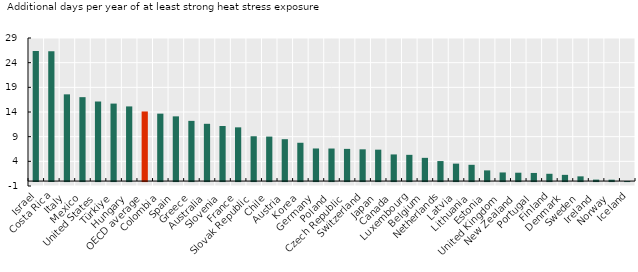
| Category | Series 0 |
|---|---|
| Israel | 26.378 |
| Costa Rica | 26.33 |
| Italy | 17.579 |
| Mexico | 17.01 |
| United States | 16.127 |
| Türkiye | 15.706 |
| Hungary | 15.131 |
| OECD average | 14.108 |
| Colombia | 13.666 |
| Spain | 13.116 |
| Greece | 12.203 |
| Australia | 11.608 |
| Slovenia | 11.167 |
| France | 10.89 |
| Slovak Republic | 9.085 |
| Chile | 9.019 |
| Austria | 8.488 |
| Korea | 7.765 |
| Germany | 6.606 |
| Poland | 6.595 |
| Czech Republic | 6.524 |
| Switzerland | 6.437 |
| Japan | 6.364 |
| Canada | 5.399 |
| Luxembourg | 5.317 |
| Belgium | 4.706 |
| Netherlands | 4.057 |
| Latvia | 3.533 |
| Lithuania | 3.295 |
| Estonia | 2.164 |
| United Kingdom | 1.747 |
| New Zealand | 1.694 |
| Portugal | 1.645 |
| Finland | 1.476 |
| Denmark | 1.259 |
| Sweden | 0.956 |
| Ireland | 0.295 |
| Norway | 0.278 |
| Iceland | 0 |